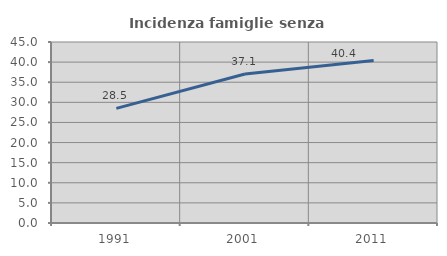
| Category | Incidenza famiglie senza nuclei |
|---|---|
| 1991.0 | 28.504 |
| 2001.0 | 37.052 |
| 2011.0 | 40.391 |